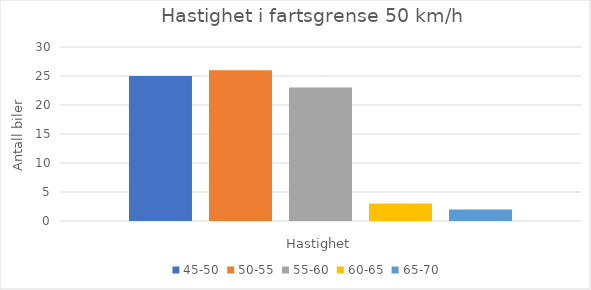
| Category | 45-50 | 50-55 | 55-60 | 60-65 | 65-70 |
|---|---|---|---|---|---|
| Frekvens, f | 25 | 26 | 23 | 3 | 2 |